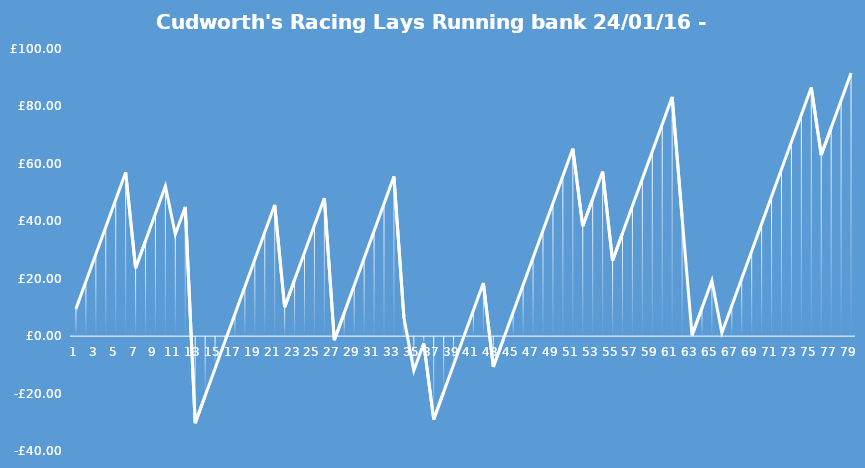
| Category | Series 0 |
|---|---|
| 0 | 9.5 |
| 1 | 19 |
| 2 | 28.5 |
| 3 | 38 |
| 4 | 47.5 |
| 5 | 57 |
| 6 | 23.7 |
| 7 | 33.2 |
| 8 | 42.7 |
| 9 | 52.2 |
| 10 | 35.5 |
| 11 | 45 |
| 12 | -30.3 |
| 13 | -20.8 |
| 14 | -11.3 |
| 15 | -1.8 |
| 16 | 7.7 |
| 17 | 17.2 |
| 18 | 26.7 |
| 19 | 36.2 |
| 20 | 45.7 |
| 21 | 10.1 |
| 22 | 19.6 |
| 23 | 29.1 |
| 24 | 38.6 |
| 25 | 48.1 |
| 26 | -1.4 |
| 27 | 8.1 |
| 28 | 17.6 |
| 29 | 27.1 |
| 30 | 36.6 |
| 31 | 46.1 |
| 32 | 55.6 |
| 33 | 6.5 |
| 34 | -12 |
| 35 | -2.5 |
| 36 | -29 |
| 37 | -19.5 |
| 38 | -10 |
| 39 | -0.5 |
| 40 | 9 |
| 41 | 18.5 |
| 42 | -10.7 |
| 43 | -1.2 |
| 44 | 8.3 |
| 45 | 17.8 |
| 46 | 27.3 |
| 47 | 36.8 |
| 48 | 46.3 |
| 49 | 55.8 |
| 50 | 65.3 |
| 51 | 38.3 |
| 52 | 47.8 |
| 53 | 57.3 |
| 54 | 26.3 |
| 55 | 35.8 |
| 56 | 45.3 |
| 57 | 54.8 |
| 58 | 64.3 |
| 59 | 73.8 |
| 60 | 83.3 |
| 61 | 41.3 |
| 62 | 0.3 |
| 63 | 9.8 |
| 64 | 19.3 |
| 65 | 1.1 |
| 66 | 10.6 |
| 67 | 20.1 |
| 68 | 29.6 |
| 69 | 39.1 |
| 70 | 48.6 |
| 71 | 58.1 |
| 72 | 67.6 |
| 73 | 77.1 |
| 74 | 86.6 |
| 75 | 63.1 |
| 76 | 72.6 |
| 77 | 82.1 |
| 78 | 91.6 |